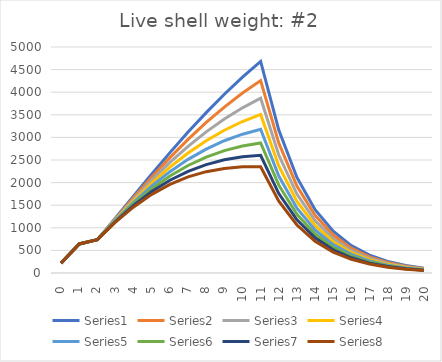
| Category | Series 0 | Series 1 | Series 2 | Series 3 | Series 4 | Series 5 | Series 6 | Series 7 |
|---|---|---|---|---|---|---|---|---|
| 0.0 | 218.885 | 218.885 | 218.885 | 218.885 | 218.885 | 218.885 | 218.885 | 218.885 |
| 1.0 | 642.182 | 642.182 | 642.182 | 642.182 | 642.182 | 642.182 | 642.182 | 642.182 |
| 2.0 | 738.721 | 738.721 | 738.721 | 738.721 | 738.721 | 738.721 | 738.721 | 738.721 |
| 3.0 | 1215.18 | 1202.388 | 1189.597 | 1176.806 | 1164.014 | 1151.223 | 1138.432 | 1125.64 |
| 4.0 | 1704.266 | 1668.576 | 1633.263 | 1598.328 | 1563.77 | 1529.591 | 1495.789 | 1462.364 |
| 5.0 | 2190.191 | 2121.753 | 2054.755 | 1989.183 | 1925.021 | 1862.253 | 1800.865 | 1740.841 |
| 6.0 | 2663.306 | 2552.925 | 2446.011 | 2342.491 | 2242.292 | 2145.342 | 2051.571 | 1960.908 |
| 7.0 | 3117.41 | 2956.754 | 2802.79 | 2655.309 | 2514.102 | 2378.967 | 2249.707 | 2126.127 |
| 8.0 | 3548.473 | 3330.174 | 3123.184 | 2927.028 | 2741.247 | 2565.399 | 2399.053 | 2241.795 |
| 9.0 | 3953.923 | 3671.622 | 3406.776 | 3158.477 | 2925.854 | 2708.074 | 2504.338 | 2313.884 |
| 10.0 | 4332.212 | 3980.556 | 3654.134 | 3351.379 | 3070.803 | 2811.001 | 2570.638 | 2348.455 |
| 11.0 | 4682.536 | 4257.154 | 3866.475 | 3507.996 | 3179.371 | 2878.401 | 2603.027 | 2351.325 |
| 12.0 | 3160.821 | 2873.678 | 2609.961 | 2367.979 | 2146.15 | 1942.988 | 1757.104 | 1587.2 |
| 13.0 | 2113.59 | 1921.583 | 1745.239 | 1583.43 | 1435.096 | 1299.245 | 1174.947 | 1061.335 |
| 14.0 | 1402.012 | 1274.647 | 1157.673 | 1050.34 | 951.945 | 861.831 | 779.38 | 704.017 |
| 15.0 | 923.58 | 839.678 | 762.621 | 691.915 | 627.097 | 567.734 | 513.419 | 463.774 |
| 16.0 | 604.753 | 549.815 | 499.358 | 453.061 | 410.618 | 371.748 | 336.183 | 303.676 |
| 17.0 | 393.895 | 358.112 | 325.248 | 295.093 | 267.449 | 242.131 | 218.967 | 197.793 |
| 18.0 | 255.355 | 232.157 | 210.852 | 191.303 | 173.382 | 156.969 | 141.952 | 128.226 |
| 19.0 | 164.85 | 149.875 | 136.121 | 123.5 | 111.931 | 101.335 | 91.64 | 82.779 |
| 20.0 | 106.024 | 96.392 | 87.546 | 79.43 | 71.989 | 65.174 | 58.939 | 53.24 |